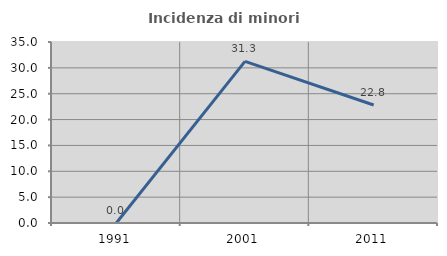
| Category | Incidenza di minori stranieri |
|---|---|
| 1991.0 | 0 |
| 2001.0 | 31.25 |
| 2011.0 | 22.826 |